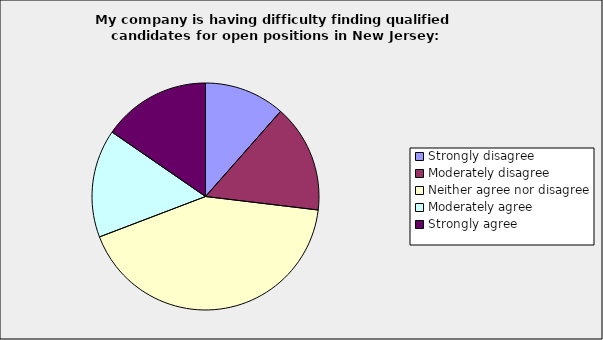
| Category | Series 0 |
|---|---|
| Strongly disagree | 0.115 |
| Moderately disagree | 0.154 |
| Neither agree nor disagree | 0.423 |
| Moderately agree | 0.154 |
| Strongly agree | 0.154 |